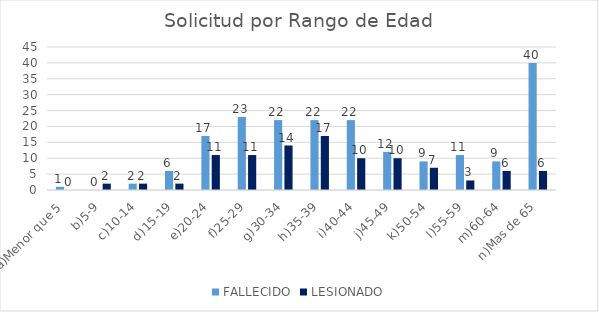
| Category | FALLECIDO | LESIONADO |
|---|---|---|
| a)Menor que 5 | 1 | 0 |
| b)5-9 | 0 | 2 |
| c)10-14 | 2 | 2 |
| d)15-19 | 6 | 2 |
| e)20-24 | 17 | 11 |
| f)25-29 | 23 | 11 |
| g)30-34 | 22 | 14 |
| h)35-39 | 22 | 17 |
| i)40-44 | 22 | 10 |
| j)45-49 | 12 | 10 |
| k)50-54 | 9 | 7 |
| l)55-59 | 11 | 3 |
| m)60-64 | 9 | 6 |
| n)Mas de 65 | 40 | 6 |